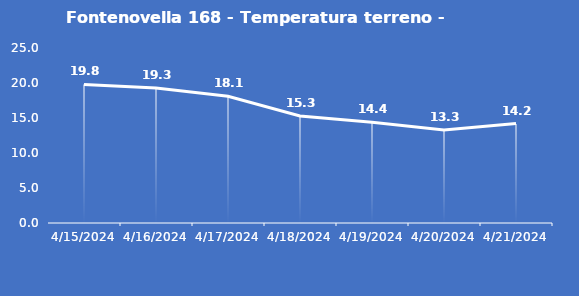
| Category | Fontenovella 168 - Temperatura terreno - Grezzo (°C) |
|---|---|
| 4/15/24 | 19.8 |
| 4/16/24 | 19.3 |
| 4/17/24 | 18.1 |
| 4/18/24 | 15.3 |
| 4/19/24 | 14.4 |
| 4/20/24 | 13.3 |
| 4/21/24 | 14.2 |